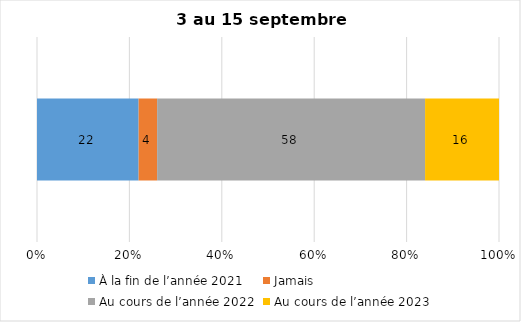
| Category | À la fin de l’année 2021 | Jamais | Au cours de l’année 2022 | Au cours de l’année 2023 |
|---|---|---|---|---|
| 0 | 22 | 4 | 58 | 16 |